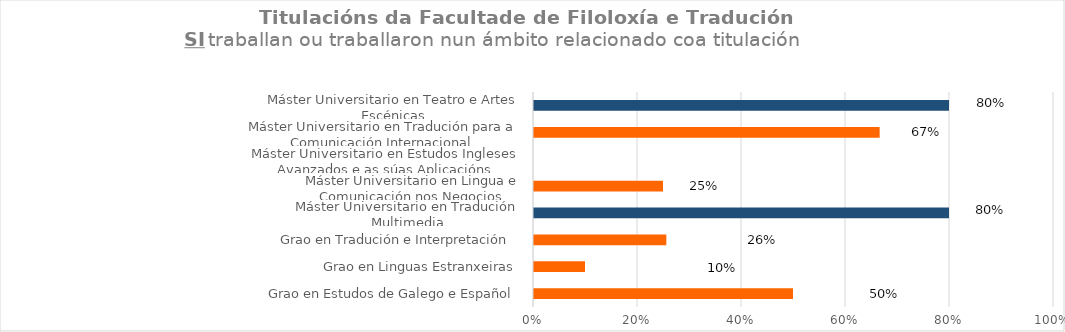
| Category | Series 1 |
|---|---|
| Grao en Estudos de Galego e Español | 0.5 |
| Grao en Linguas Estranxeiras | 0.1 |
| Grao en Tradución e Interpretación  | 0.256 |
| Máster Universitario en Tradución Multimedia | 0.8 |
| Máster Universitario en Lingua e Comunicación nos Negocios | 0.25 |
| Máster Universitario en Estudos Ingleses Avanzados e as súas Aplicacións | 0 |
| Máster Universitario en Tradución para a Comunicación Internacional  | 0.667 |
| Máster Universitario en Teatro e Artes Escénicas | 0.8 |